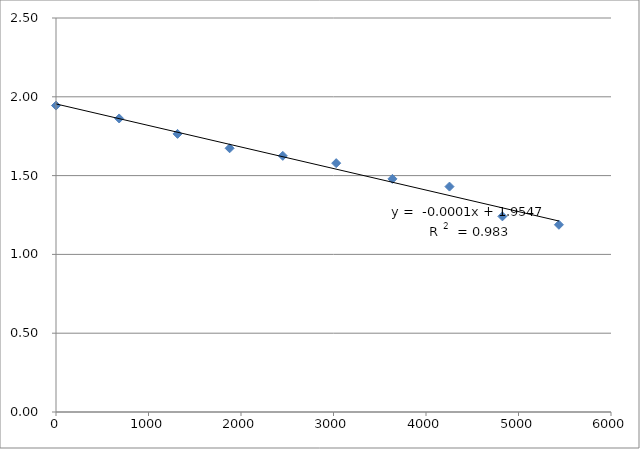
| Category | ln(V∞-Vt) |
|---|---|
| 0.0 | 1.944 |
| 682.9999999999949 | 1.863 |
| 1314.0000000000039 | 1.765 |
| 1876.9999999999993 | 1.673 |
| 2452.000000000006 | 1.625 |
| 3028.9999999999973 | 1.579 |
| 3636.9999999999995 | 1.479 |
| 4254.000000000003 | 1.43 |
| 4826.0 | 1.241 |
| 5437.000000000002 | 1.188 |